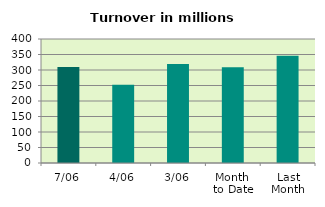
| Category | Series 0 |
|---|---|
| 7/06 | 309.545 |
| 4/06 | 252.646 |
| 3/06 | 319.715 |
| Month 
to Date | 308.977 |
| Last
Month | 346.329 |